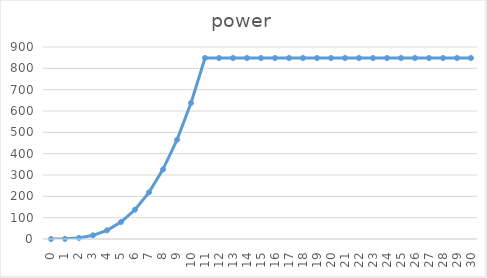
| Category | power |
|---|---|
| 0.0 | 0 |
| 1.0 | 0.637 |
| 2.0 | 5.098 |
| 3.0 | 17.207 |
| 4.0 | 40.787 |
| 5.0 | 79.663 |
| 6.0 | 137.658 |
| 7.0 | 218.595 |
| 8.0 | 326.299 |
| 9.0 | 464.594 |
| 10.0 | 637.303 |
| 11.0 | 848.251 |
| 12.0 | 848.251 |
| 13.0 | 848.251 |
| 14.0 | 848.251 |
| 15.0 | 848.251 |
| 16.0 | 848.251 |
| 17.0 | 848.251 |
| 18.0 | 848.251 |
| 19.0 | 848.251 |
| 20.0 | 848.251 |
| 21.0 | 848.251 |
| 22.0 | 848.251 |
| 23.0 | 848.251 |
| 24.0 | 848.251 |
| 25.0 | 848.251 |
| 26.0 | 848.251 |
| 27.0 | 848.251 |
| 28.0 | 848.251 |
| 29.0 | 848.251 |
| 30.0 | 848.251 |